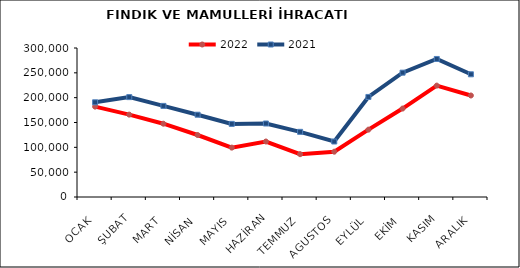
| Category | 2022 | 2021 |
|---|---|---|
| OCAK | 181950.724 | 190660.467 |
| ŞUBAT | 165835.788 | 201115.472 |
| MART | 147564.067 | 183441.243 |
| NİSAN | 124825.162 | 165697.966 |
| MAYIS | 99421.29 | 147226.883 |
| HAZİRAN | 111705.488 | 147977.087 |
| TEMMUZ | 86229.482 | 131215.73 |
| AGUSTOS | 91212.785 | 111714.378 |
| EYLÜL | 135579.101 | 201450.546 |
| EKİM | 178082.005 | 250347.525 |
| KASIM | 224285.446 | 277935.374 |
| ARALIK | 204363.844 | 247053.089 |